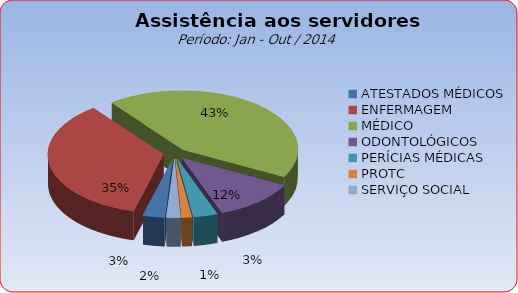
| Category | Series 0 |
|---|---|
| ATESTADOS MÉDICOS | 3.041 |
| ENFERMAGEM | 35.453 |
| MÉDICO | 43.18 |
| ODONTOLÓGICOS | 11.613 |
| PERÍCIAS MÉDICAS | 3.364 |
| PROTC | 1.398 |
| SERVIÇO SOCIAL | 1.951 |